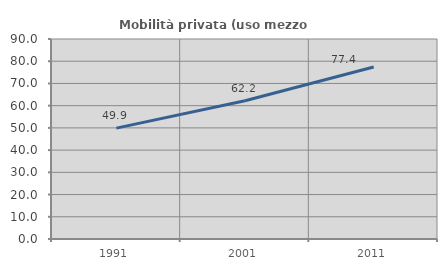
| Category | Mobilità privata (uso mezzo privato) |
|---|---|
| 1991.0 | 49.897 |
| 2001.0 | 62.206 |
| 2011.0 | 77.434 |